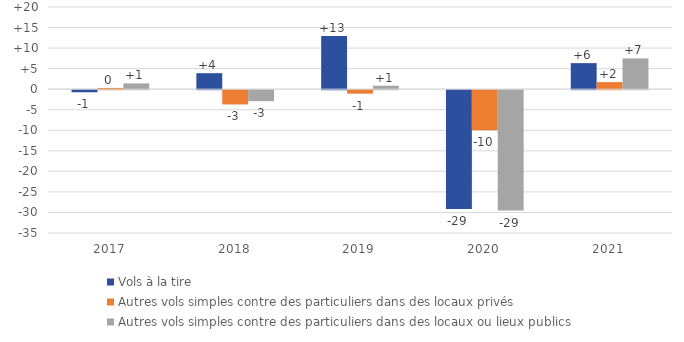
| Category | Vols à la tire | Autres vols simples contre des particuliers dans des locaux privés
 | Autres vols simples contre des particuliers dans des locaux ou lieux publics |
|---|---|---|---|
| 2017.0 | -0.505 | 0.305 | 1.411 |
| 2018.0 | 3.893 | -3.469 | -2.674 |
| 2019.0 | 12.946 | -0.846 | 0.844 |
| 2020.0 | -28.943 | -9.73 | -29.288 |
| 2021.0 | 6.34 | 1.73 | 7.48 |